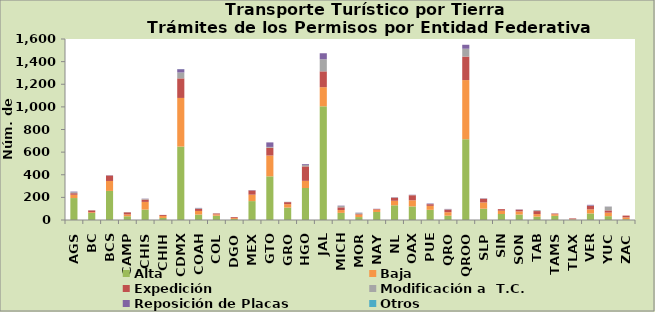
| Category | Alta                                         | Baja | Expedición | Modificación a  T.C. | Reposición de Placas | Otros |
|---|---|---|---|---|---|---|
| AGS | 194 | 29 | 14 | 9 | 5 | 0 |
| BC | 62 | 7 | 16 | 1 | 0 | 0 |
| BCS | 257 | 88 | 48 | 1 | 2 | 0 |
| CAMP | 33 | 16 | 19 | 2 | 0 | 0 |
| CHIS | 92 | 68 | 21 | 6 | 2 | 0 |
| CHIH | 18 | 18 | 9 | 0 | 0 | 0 |
| CDMX | 649 | 430 | 173 | 52 | 29 | 1 |
| COAH | 48 | 32 | 18 | 6 | 3 | 0 |
| COL | 38 | 12 | 8 | 1 | 0 | 0 |
| DGO | 9 | 8 | 8 | 0 | 0 | 0 |
| MEX | 167 | 57 | 37 | 0 | 3 | 0 |
| GTO | 386 | 184 | 69 | 7 | 40 | 0 |
| GRO | 110 | 30 | 18 | 3 | 0 | 0 |
| HGO | 283 | 63 | 128 | 14 | 7 | 0 |
| JAL | 1005 | 169 | 140 | 107 | 53 | 0 |
| MICH | 63 | 25 | 24 | 12 | 3 | 0 |
| MOR | 26 | 22 | 6 | 9 | 2 | 0 |
| NAY | 71 | 21 | 5 | 0 | 2 | 0 |
| NL | 130 | 40 | 27 | 3 | 2 | 0 |
| OAX | 120 | 54 | 45 | 2 | 2 | 0 |
| PUE | 90 | 35 | 15 | 2 | 4 | 0 |
| QRO | 38 | 31 | 23 | 3 | 3 | 0 |
| QROO | 714 | 523 | 208 | 69 | 35 | 0 |
| SLP | 100 | 55 | 33 | 2 | 2 | 0 |
| SIN | 53 | 29 | 14 | 0 | 0 | 0 |
| SON | 48 | 28 | 15 | 1 | 2 | 0 |
| TAB | 30 | 22 | 27 | 8 | 0 | 0 |
| TAMS | 37 | 14 | 6 | 0 | 1 | 0 |
| TLAX | 4 | 3 | 7 | 0 | 0 | 0 |
| VER | 58 | 36 | 32 | 2 | 6 | 0 |
| YUC | 34 | 31 | 20 | 33 | 1 | 0 |
| ZAC | 7 | 16 | 16 | 0 | 0 | 0 |